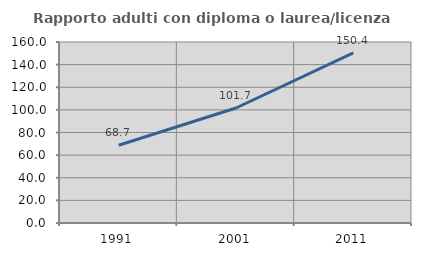
| Category | Rapporto adulti con diploma o laurea/licenza media  |
|---|---|
| 1991.0 | 68.696 |
| 2001.0 | 101.653 |
| 2011.0 | 150.363 |